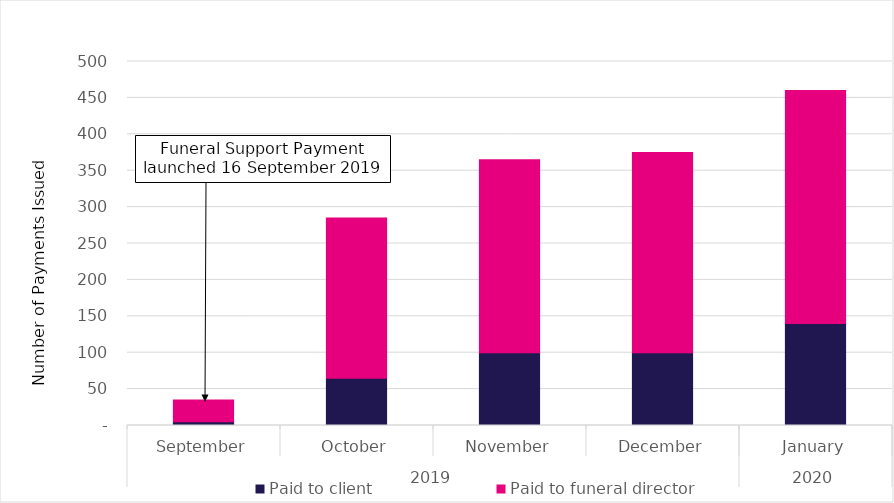
| Category | Paid to client | Paid to funeral director |
|---|---|---|
| 0 | 5 | 30 |
| 1 | 65 | 220 |
| 2 | 100 | 265 |
| 3 | 100 | 275 |
| 4 | 140 | 320 |